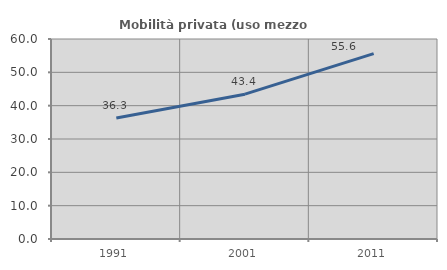
| Category | Mobilità privata (uso mezzo privato) |
|---|---|
| 1991.0 | 36.277 |
| 2001.0 | 43.449 |
| 2011.0 | 55.599 |